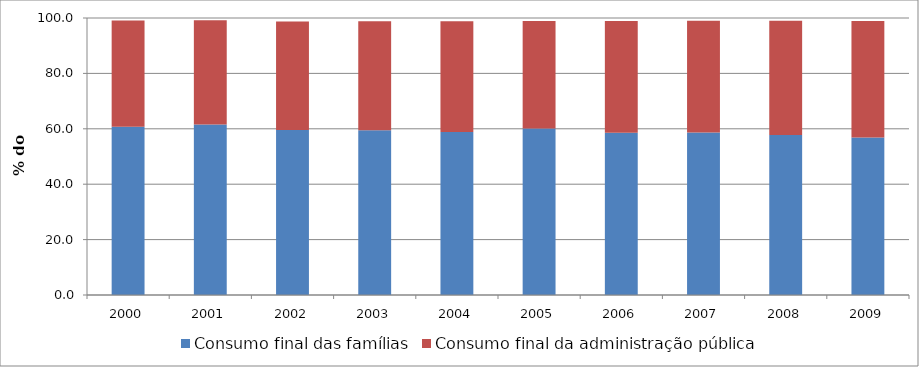
| Category | Consumo final das famílias | Consumo final da administração pública |
|---|---|---|
| 2000.0 | 60.753 | 38.351 |
| 2001.0 | 61.538 | 37.66 |
| 2002.0 | 59.547 | 39.18 |
| 2003.0 | 59.456 | 39.378 |
| 2004.0 | 58.803 | 40.046 |
| 2005.0 | 60.15 | 38.782 |
| 2006.0 | 58.546 | 40.415 |
| 2007.0 | 58.668 | 40.307 |
| 2008.0 | 57.752 | 41.24 |
| 2009.0 | 56.865 | 42.094 |